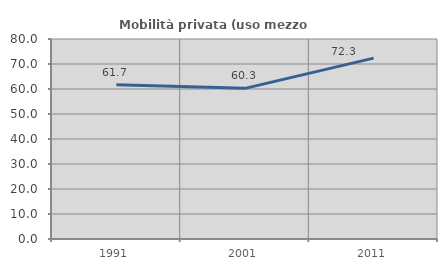
| Category | Mobilità privata (uso mezzo privato) |
|---|---|
| 1991.0 | 61.682 |
| 2001.0 | 60.256 |
| 2011.0 | 72.34 |